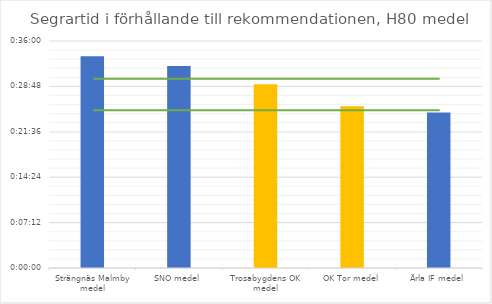
| Category | H80 tid |
|---|---|
| Strängnäs Malmby medel | 0.023 |
| SNO medel | 0.022 |
| Trosabygdens OK medel | 0.02 |
| OK Tor medel | 0.018 |
| Ärla IF medel | 0.017 |